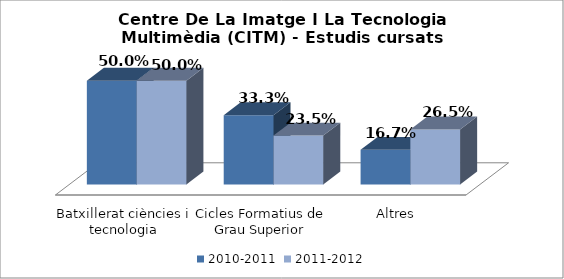
| Category | 2010-2011 | 2011-2012 |
|---|---|---|
| Batxillerat ciències i tecnologia | 0.5 | 0.5 |
| Cicles Formatius de Grau Superior | 0.333 | 0.235 |
| Altres | 0.167 | 0.265 |